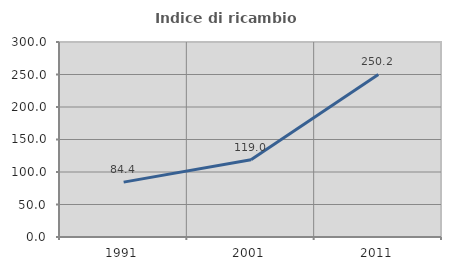
| Category | Indice di ricambio occupazionale  |
|---|---|
| 1991.0 | 84.416 |
| 2001.0 | 118.988 |
| 2011.0 | 250.166 |